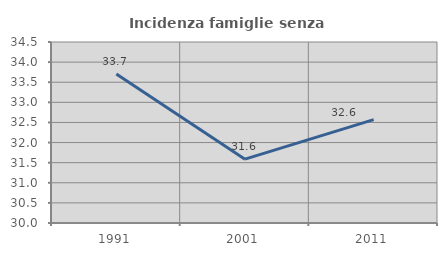
| Category | Incidenza famiglie senza nuclei |
|---|---|
| 1991.0 | 33.706 |
| 2001.0 | 31.587 |
| 2011.0 | 32.571 |